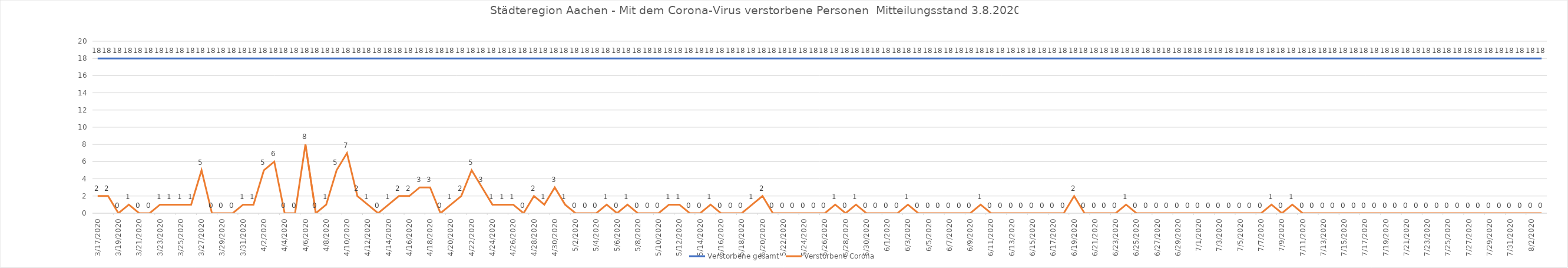
| Category | Verstorbene gesamt | Verstorbene Corona |
|---|---|---|
| 3/17/20 | 18 | 2 |
| 3/18/20 | 18 | 2 |
| 3/19/20 | 18 | 0 |
| 3/20/20 | 18 | 1 |
| 3/21/20 | 18 | 0 |
| 3/22/20 | 18 | 0 |
| 3/23/20 | 18 | 1 |
| 3/24/20 | 18 | 1 |
| 3/25/20 | 18 | 1 |
| 3/26/20 | 18 | 1 |
| 3/27/20 | 18 | 5 |
| 3/28/20 | 18 | 0 |
| 3/29/20 | 18 | 0 |
| 3/30/20 | 18 | 0 |
| 3/31/20 | 18 | 1 |
| 4/1/20 | 18 | 1 |
| 4/2/20 | 18 | 5 |
| 4/3/20 | 18 | 6 |
| 4/4/20 | 18 | 0 |
| 4/5/20 | 18 | 0 |
| 4/6/20 | 18 | 8 |
| 4/7/20 | 18 | 0 |
| 4/8/20 | 18 | 1 |
| 4/9/20 | 18 | 5 |
| 4/10/20 | 18 | 7 |
| 4/11/20 | 18 | 2 |
| 4/12/20 | 18 | 1 |
| 4/13/20 | 18 | 0 |
| 4/14/20 | 18 | 1 |
| 4/15/20 | 18 | 2 |
| 4/16/20 | 18 | 2 |
| 4/17/20 | 18 | 3 |
| 4/18/20 | 18 | 3 |
| 4/19/20 | 18 | 0 |
| 4/20/20 | 18 | 1 |
| 4/21/20 | 18 | 2 |
| 4/22/20 | 18 | 5 |
| 4/23/20 | 18 | 3 |
| 4/24/20 | 18 | 1 |
| 4/25/20 | 18 | 1 |
| 4/26/20 | 18 | 1 |
| 4/27/20 | 18 | 0 |
| 4/28/20 | 18 | 2 |
| 4/29/20 | 18 | 1 |
| 4/30/20 | 18 | 3 |
| 5/1/20 | 18 | 1 |
| 5/2/20 | 18 | 0 |
| 5/3/20 | 18 | 0 |
| 5/4/20 | 18 | 0 |
| 5/5/20 | 18 | 1 |
| 5/6/20 | 18 | 0 |
| 5/7/20 | 18 | 1 |
| 5/8/20 | 18 | 0 |
| 5/9/20 | 18 | 0 |
| 5/10/20 | 18 | 0 |
| 5/11/20 | 18 | 1 |
| 5/12/20 | 18 | 1 |
| 5/13/20 | 18 | 0 |
| 5/14/20 | 18 | 0 |
| 5/15/20 | 18 | 1 |
| 5/16/20 | 18 | 0 |
| 5/17/20 | 18 | 0 |
| 5/18/20 | 18 | 0 |
| 5/19/20 | 18 | 1 |
| 5/20/20 | 18 | 2 |
| 5/21/20 | 18 | 0 |
| 5/22/20 | 18 | 0 |
| 5/23/20 | 18 | 0 |
| 5/24/20 | 18 | 0 |
| 5/25/20 | 18 | 0 |
| 5/26/20 | 18 | 0 |
| 5/27/20 | 18 | 1 |
| 5/28/20 | 18 | 0 |
| 5/29/20 | 18 | 1 |
| 5/30/20 | 18 | 0 |
| 5/31/20 | 18 | 0 |
| 6/1/20 | 18 | 0 |
| 6/2/20 | 18 | 0 |
| 6/3/20 | 18 | 1 |
| 6/4/20 | 18 | 0 |
| 6/5/20 | 18 | 0 |
| 6/6/20 | 18 | 0 |
| 6/7/20 | 18 | 0 |
| 6/8/20 | 18 | 0 |
| 6/9/20 | 18 | 0 |
| 6/10/20 | 18 | 1 |
| 6/11/20 | 18 | 0 |
| 6/12/20 | 18 | 0 |
| 6/13/20 | 18 | 0 |
| 6/14/20 | 18 | 0 |
| 6/15/20 | 18 | 0 |
| 6/16/20 | 18 | 0 |
| 6/17/20 | 18 | 0 |
| 6/18/20 | 18 | 0 |
| 6/19/20 | 18 | 2 |
| 6/20/20 | 18 | 0 |
| 6/21/20 | 18 | 0 |
| 6/22/20 | 18 | 0 |
| 6/23/20 | 18 | 0 |
| 6/24/20 | 18 | 1 |
| 6/25/20 | 18 | 0 |
| 6/26/20 | 18 | 0 |
| 6/27/20 | 18 | 0 |
| 6/28/20 | 18 | 0 |
| 6/29/20 | 18 | 0 |
| 6/30/20 | 18 | 0 |
| 7/1/20 | 18 | 0 |
| 7/2/20 | 18 | 0 |
| 7/3/20 | 18 | 0 |
| 7/4/20 | 18 | 0 |
| 7/5/20 | 18 | 0 |
| 7/6/20 | 18 | 0 |
| 7/7/20 | 18 | 0 |
| 7/8/20 | 18 | 1 |
| 7/9/20 | 18 | 0 |
| 7/10/20 | 18 | 1 |
| 7/11/20 | 18 | 0 |
| 7/12/20 | 18 | 0 |
| 7/13/20 | 18 | 0 |
| 7/14/20 | 18 | 0 |
| 7/15/20 | 18 | 0 |
| 7/16/20 | 18 | 0 |
| 7/17/20 | 18 | 0 |
| 7/18/20 | 18 | 0 |
| 7/19/20 | 18 | 0 |
| 7/20/20 | 18 | 0 |
| 7/21/20 | 18 | 0 |
| 7/22/20 | 18 | 0 |
| 7/23/20 | 18 | 0 |
| 7/24/20 | 18 | 0 |
| 7/25/20 | 18 | 0 |
| 7/26/20 | 18 | 0 |
| 7/27/20 | 18 | 0 |
| 7/28/20 | 18 | 0 |
| 7/29/20 | 18 | 0 |
| 7/30/20 | 18 | 0 |
| 7/31/20 | 18 | 0 |
| 8/1/20 | 18 | 0 |
| 8/2/20 | 18 | 0 |
| 8/3/20 | 18 | 0 |